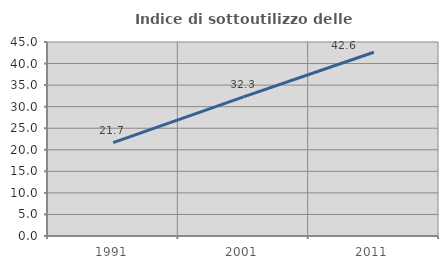
| Category | Indice di sottoutilizzo delle abitazioni  |
|---|---|
| 1991.0 | 21.656 |
| 2001.0 | 32.283 |
| 2011.0 | 42.623 |